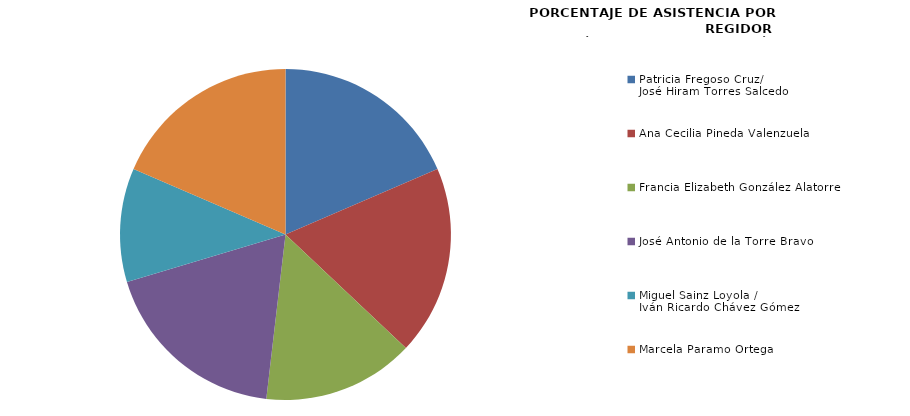
| Category | Series 0 |
|---|---|
| Patricia Fregoso Cruz/
José Hiram Torres Salcedo | 100 |
| Ana Cecilia Pineda Valenzuela | 100 |
| Francia Elizabeth González Alatorre | 80 |
| José Antonio de la Torre Bravo | 100 |
| Miguel Sainz Loyola / 
Iván Ricardo Chávez Gómez | 60 |
| Marcela Paramo Ortega | 100 |